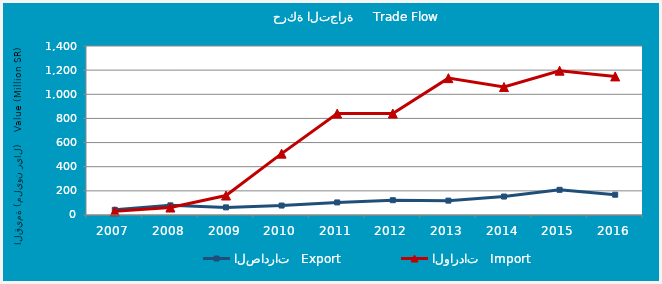
| Category | الصادرات   Export | الواردات   Import |
|---|---|---|
| 2007.0 | 42.891 | 30.666 |
| 2008.0 | 79.98 | 61.781 |
| 2009.0 | 63.061 | 161.457 |
| 2010.0 | 78.403 | 508.191 |
| 2011.0 | 104.133 | 839.944 |
| 2012.0 | 122.534 | 840.443 |
| 2013.0 | 119.015 | 1133.8 |
| 2014.0 | 152.952 | 1060.078 |
| 2015.0 | 208.585 | 1195.469 |
| 2016.0 | 167.958 | 1147.932 |